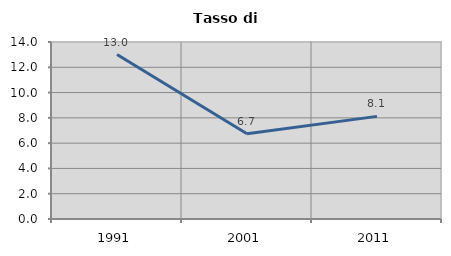
| Category | Tasso di disoccupazione   |
|---|---|
| 1991.0 | 13.011 |
| 2001.0 | 6.736 |
| 2011.0 | 8.118 |